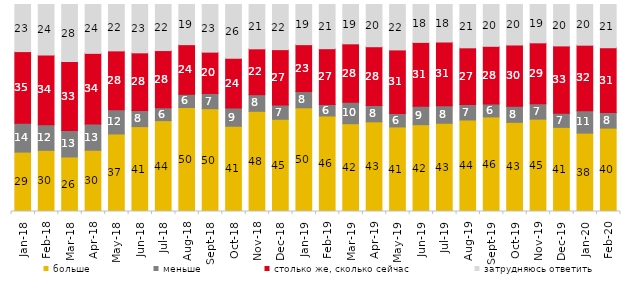
| Category | больше | меньше | столько же, сколько сейчас | затрудняюсь ответить |
|---|---|---|---|---|
| 2018-01-01 | 28.7 | 13.9 | 34.65 | 22.75 |
| 2018-02-01 | 29.55 | 12.4 | 33.7 | 24.35 |
| 2018-03-01 | 26.35 | 12.75 | 33.35 | 27.55 |
| 2018-04-01 | 29.6 | 12.7 | 34.1 | 23.6 |
| 2018-05-01 | 37.45 | 11.7 | 28.45 | 22.4 |
| 2018-06-01 | 41 | 7.8 | 27.85 | 23.35 |
| 2018-07-01 | 43.9 | 6.25 | 27.6 | 22.25 |
| 2018-08-01 | 50.25 | 6.35 | 24 | 19.4 |
| 2018-09-01 | 49.65 | 7.35 | 19.95 | 23 |
| 2018-10-01 | 41.2 | 8.85 | 23.95 | 26 |
| 2018-11-01 | 48.403 | 8.034 | 22.156 | 21.407 |
| 2018-12-01 | 44.55 | 6.95 | 26.7 | 21.8 |
| 2019-01-01 | 50.1 | 7.85 | 22.65 | 19.4 |
| 2019-02-01 | 46.15 | 5.6 | 26.9 | 21.35 |
| 2019-03-01 | 42.417 | 10.343 | 28.245 | 18.996 |
| 2019-04-01 | 43.317 | 7.871 | 28.416 | 20.396 |
| 2019-05-01 | 40.862 | 6.439 | 30.758 | 21.942 |
| 2019-06-01 | 41.945 | 8.878 | 30.873 | 18.304 |
| 2019-07-01 | 42.624 | 8.465 | 30.792 | 18.119 |
| 2019-08-01 | 44.206 | 7.493 | 27.373 | 20.929 |
| 2019-09-01 | 45.693 | 6.287 | 27.822 | 20.198 |
| 2019-10-01 | 43.069 | 7.723 | 29.653 | 19.554 |
| 2019-11-01 | 44.604 | 7.426 | 29.455 | 18.515 |
| 2019-12-01 | 40.644 | 6.782 | 32.574 | 20 |
| 2020-01-01 | 37.871 | 10.842 | 31.634 | 19.653 |
| 2020-02-01 | 40.297 | 7.525 | 31.287 | 20.891 |